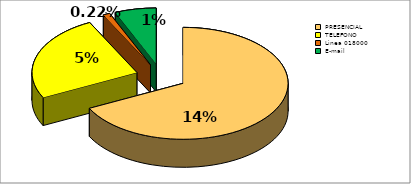
| Category | Series 0 |
|---|---|
| PRESENCIAL | 0.144 |
| TELEFONO | 0.053 |
| Lìnea 018000 | 0.002 |
| E-mail | 0.014 |